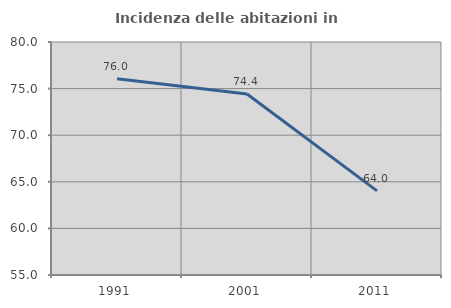
| Category | Incidenza delle abitazioni in proprietà  |
|---|---|
| 1991.0 | 76.049 |
| 2001.0 | 74.419 |
| 2011.0 | 64.029 |